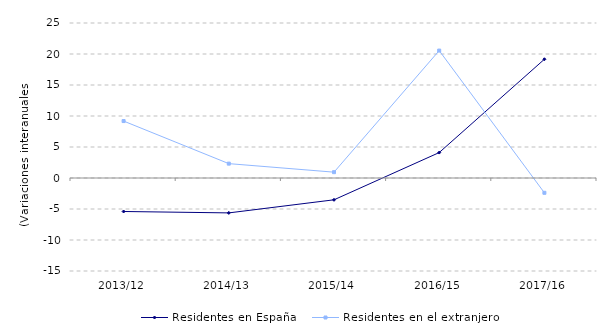
| Category | Residentes en España | Residentes en el extranjero |
|---|---|---|
| 2013/12 | -5.402 | 9.184 |
| 2014/13 | -5.629 | 2.317 |
| 2015/14 | -3.516 | 0.941 |
| 2016/15 | 4.102 | 20.552 |
| 2017/16 | 19.152 | -2.388 |